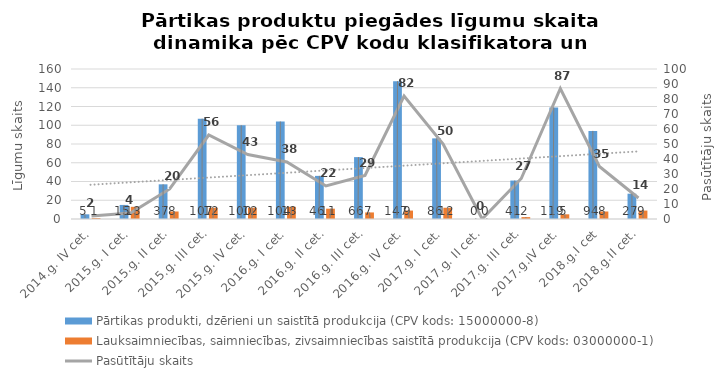
| Category | Pārtikas produkti, dzērieni un saistītā produkcija (CPV kods: 15000000-8) | Lauksaimniecības, saimniecības, zivsaimniecības saistītā produkcija (CPV kods: 03000000-1) |
|---|---|---|
| 2014.g. IV cet. | 5 | 1 |
| 2015.g. I cet. | 15 | 13 |
| 2015.g. II cet. | 37 | 8 |
| 2015.g. III cet. | 107 | 12 |
| 2015.g. IV cet. | 100 | 12 |
| 2016.g. I cet. | 104 | 13 |
| 2016.g. II cet. | 46 | 11 |
| 2016.g. III cet. | 66 | 7 |
| 2016.g. IV cet. | 147 | 9 |
| 2017.g. I cet. | 86 | 12 |
| 2017.g. II cet. | 0 | 0 |
| 2017.g. III cet. | 41 | 2 |
| 2017.g.IV cet. | 119 | 5 |
| 2018.g.I cet | 94 | 8 |
| 2018.g.II cet. | 27 | 9 |